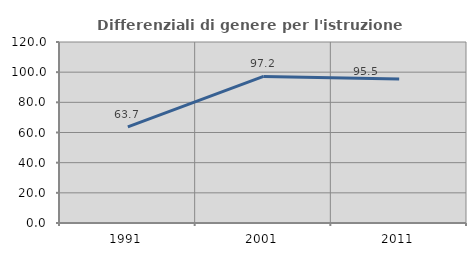
| Category | Differenziali di genere per l'istruzione superiore |
|---|---|
| 1991.0 | 63.683 |
| 2001.0 | 97.197 |
| 2011.0 | 95.496 |